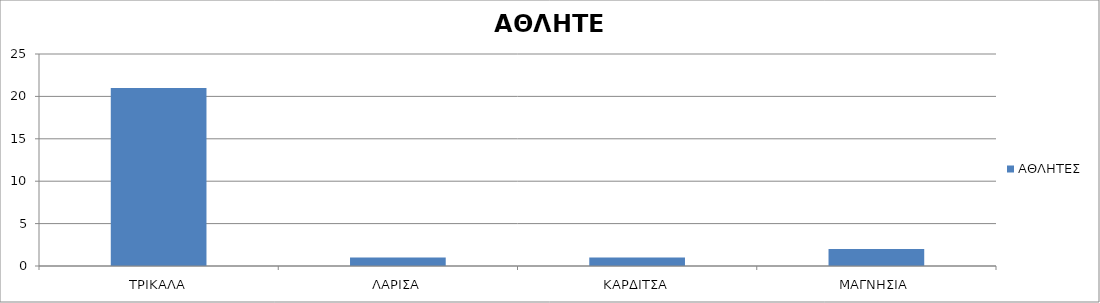
| Category | ΑΘΛΗΤΕΣ |
|---|---|
| ΤΡΙΚΑΛΑ | 21 |
| ΛΑΡΙΣΑ | 1 |
| ΚΑΡΔΙΤΣΑ | 1 |
| ΜΑΓΝΗΣΙΑ | 2 |